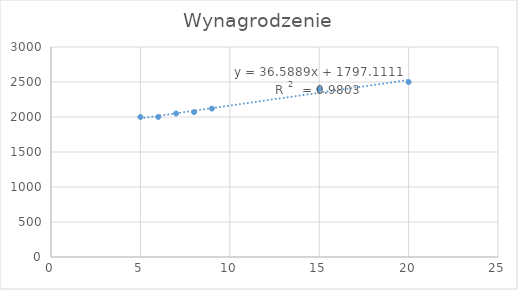
| Category | Wynagrodzenie |
|---|---|
| 5.0 | 2000 |
| 6.0 | 2001 |
| 7.0 | 2050 |
| 8.0 | 2070 |
| 9.0 | 2120 |
| 15.0 | 2400 |
| 20.0 | 2500 |